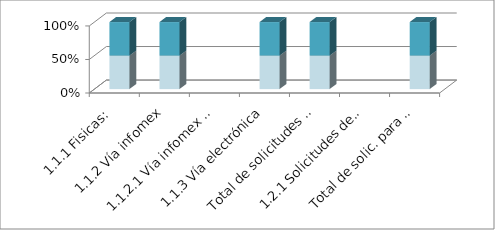
| Category | Series 3 | Series 4 | Series 5 | Series 0 | Series 1 | Series 2 |
|---|---|---|---|---|---|---|
| 1.1.1 Fisicas: |  |  | 1 |  |  | 1 |
| 1.1.2 Vía infomex |  |  | 15 |  |  | 15 |
| 1.1.2.1 Vía infomex - PNT |  |  | 0 |  |  | 0 |
| 1.1.3 Vía electrónica |  |  | 21 |  |  | 21 |
| Total de solicitudes recibidas: |  |  | 37 |  |  | 37 |
| 1.2.1 Solicitudes derivadas por incom |  |  | 0 |  |  | 0 |
| Total de solic. para resolución: |  |  | 37 |  |  | 37 |